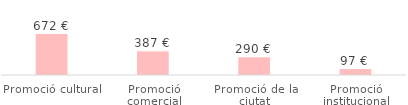
| Category | Total |
|---|---|
| Promoció cultural | 672 |
| Promoció comercial | 387.2 |
| Promoció de la ciutat | 290.4 |
| Promoció institucional | 96.8 |